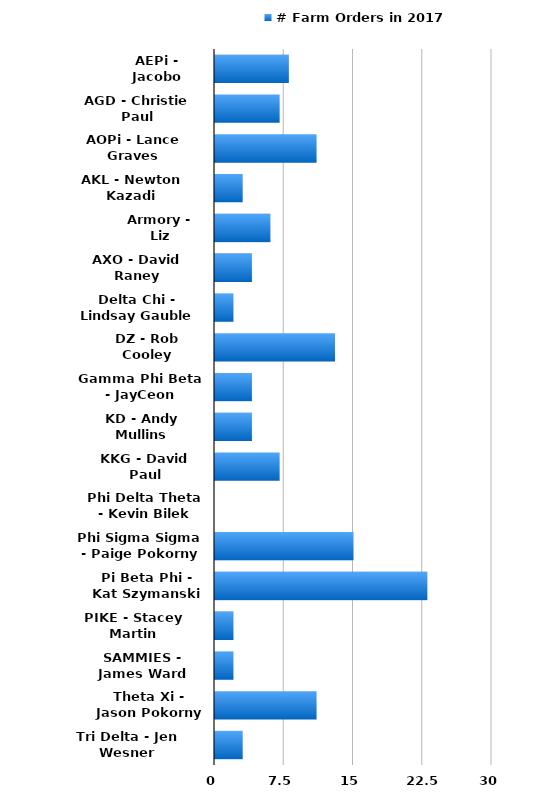
| Category | # Farm Orders in 2017 |
|---|---|
| AEPi - Jacobo Rodriguez | 8 |
| AGD - Christie Paul | 7 |
| AOPi - Lance Graves | 11 |
| AKL - Newton Kazadi | 3 |
| Armory - Liz Mansfield | 6 |
| AXO - David Raney | 4 |
| Delta Chi - Lindsay Gauble | 2 |
| DZ - Rob Cooley | 13 |
| Gamma Phi Beta - JayCeon Huffman | 4 |
| KD - Andy Mullins | 4 |
| KKG - David Paul | 7 |
| Phi Delta Theta - Kevin Bilek | 0 |
| Phi Sigma Sigma - Paige Pokorny | 15 |
| Pi Beta Phi - Kat Szymanski | 23 |
| PIKE - Stacey Martin | 2 |
| SAMMIES - James Ward | 2 |
| Theta Xi - Jason Pokorny | 11 |
| Tri Delta - Jen Wesner | 3 |